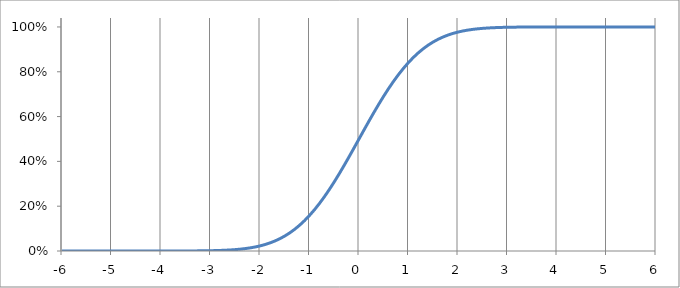
| Category | Series 0 |
|---|---|
| -6.0 | 0 |
| -5.9 | 0 |
| -5.8 | 0 |
| -5.7 | 0 |
| -5.6 | 0 |
| -5.5 | 0 |
| -5.4 | 0 |
| -5.3 | 0 |
| -5.2 | 0 |
| -5.1 | 0 |
| -5.0 | 0 |
| -4.9 | 0 |
| -4.8 | 0 |
| -4.7 | 0 |
| -4.6 | 0 |
| -4.5 | 0 |
| -4.4 | 0 |
| -4.3 | 0 |
| -4.2 | 0 |
| -4.1 | 0 |
| -4.0 | 0 |
| -3.9 | 0 |
| -3.8 | 0 |
| -3.7 | 0 |
| -3.6 | 0 |
| -3.5 | 0 |
| -3.4 | 0 |
| -3.3 | 0 |
| -3.2 | 0.001 |
| -3.1 | 0.001 |
| -3.0 | 0.001 |
| -2.9 | 0.002 |
| -2.8 | 0.003 |
| -2.7 | 0.003 |
| -2.6 | 0.005 |
| -2.5 | 0.006 |
| -2.4 | 0.008 |
| -2.3 | 0.011 |
| -2.2 | 0.014 |
| -2.1 | 0.018 |
| -2.0 | 0.023 |
| -1.9 | 0.029 |
| -1.8 | 0.036 |
| -1.7 | 0.045 |
| -1.6 | 0.055 |
| -1.5 | 0.067 |
| -1.4 | 0.081 |
| -1.3 | 0.097 |
| -1.2 | 0.115 |
| -1.1 | 0.136 |
| -1.0 | 0.159 |
| -0.9 | 0.184 |
| -0.8 | 0.212 |
| -0.7 | 0.242 |
| -0.6 | 0.274 |
| -0.5 | 0.309 |
| -0.4 | 0.345 |
| -0.3 | 0.382 |
| -0.2 | 0.421 |
| -0.1 | 0.46 |
| 0.0 | 0.5 |
| 0.1 | 0.54 |
| 0.2 | 0.579 |
| 0.3 | 0.618 |
| 0.4 | 0.655 |
| 0.5 | 0.691 |
| 0.6 | 0.726 |
| 0.7 | 0.758 |
| 0.8 | 0.788 |
| 0.9 | 0.816 |
| 1.0 | 0.841 |
| 1.1 | 0.864 |
| 1.2 | 0.885 |
| 1.3 | 0.903 |
| 1.4 | 0.919 |
| 1.5 | 0.933 |
| 1.6 | 0.945 |
| 1.7 | 0.955 |
| 1.8 | 0.964 |
| 1.9 | 0.971 |
| 2.0 | 0.977 |
| 2.1 | 0.982 |
| 2.2 | 0.986 |
| 2.3 | 0.989 |
| 2.4 | 0.992 |
| 2.5 | 0.994 |
| 2.6 | 0.995 |
| 2.7 | 0.997 |
| 2.8 | 0.997 |
| 2.9 | 0.998 |
| 3.0 | 0.999 |
| 3.1 | 0.999 |
| 3.2 | 0.999 |
| 3.3 | 1 |
| 3.4 | 1 |
| 3.5 | 1 |
| 3.6 | 1 |
| 3.7 | 1 |
| 3.8 | 1 |
| 3.9 | 1 |
| 4.0 | 1 |
| 4.1 | 1 |
| 4.2 | 1 |
| 4.3 | 1 |
| 4.4 | 1 |
| 4.5 | 1 |
| 4.6 | 1 |
| 4.7 | 1 |
| 4.8 | 1 |
| 4.9 | 1 |
| 5.0 | 1 |
| 5.1 | 1 |
| 5.2 | 1 |
| 5.3 | 1 |
| 5.4 | 1 |
| 5.5 | 1 |
| 5.6 | 1 |
| 5.7 | 1 |
| 5.8 | 1 |
| 5.9 | 1 |
| 6.0 | 1 |